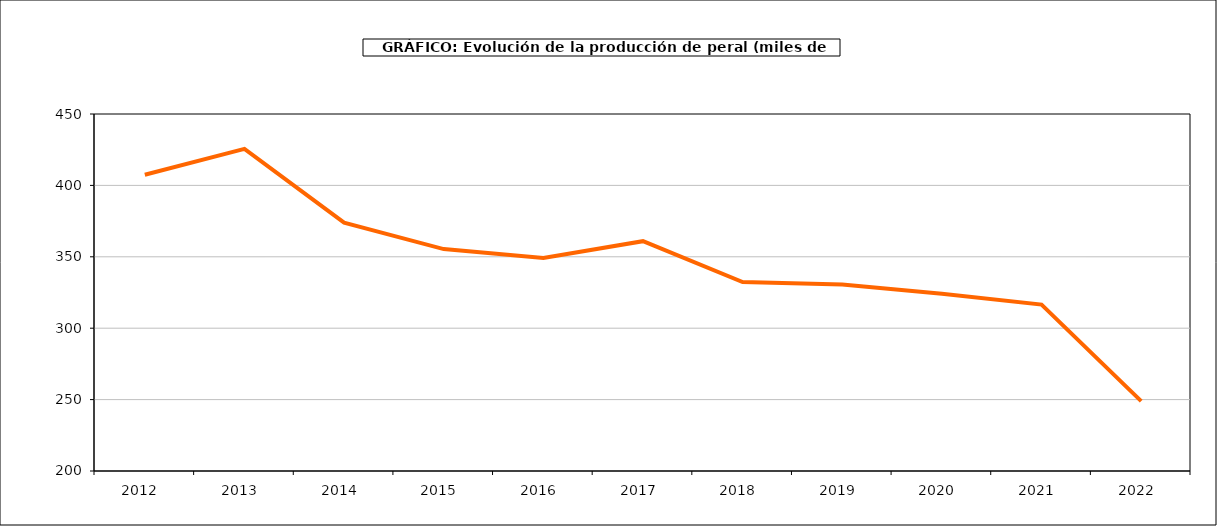
| Category | producción peral |
|---|---|
| 2012.0 | 407.428 |
| 2013.0 | 425.56 |
| 2014.0 | 373.865 |
| 2015.0 | 355.41 |
| 2016.0 | 349.247 |
| 2017.0 | 360.957 |
| 2018.0 | 332.319 |
| 2019.0 | 330.67 |
| 2020.0 | 324.049 |
| 2021.0 | 316.513 |
| 2022.0 | 248.974 |